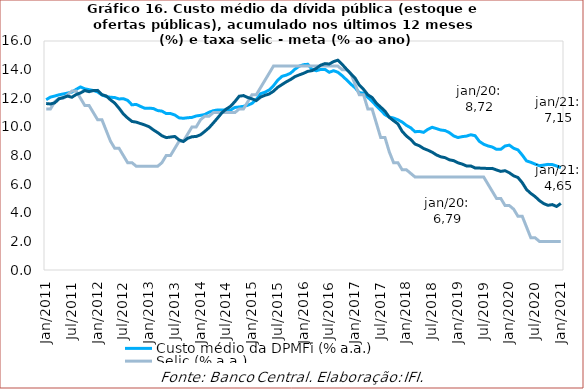
| Category | Custo médio da DPMFi (% a.a.) | Selic (% a.a.) | Custo médio oferta pública DPMFi (% a.a.) |
|---|---|---|---|
| 2011-01-31 | 11.9 | 11.25 | 11.63 |
| 2011-02-28 | 12.08 | 11.25 | 11.6 |
| 2011-03-31 | 12.155 | 11.75 | 11.68 |
| 2011-04-30 | 12.24 | 12 | 11.96 |
| 2011-05-31 | 12.3 | 12 | 12.05 |
| 2011-06-30 | 12.36 | 12.25 | 12.15 |
| 2011-07-31 | 12.43 | 12.5 | 12.07 |
| 2011-08-31 | 12.62 | 12.5 | 12.26 |
| 2011-09-30 | 12.79 | 12 | 12.37 |
| 2011-10-31 | 12.66 | 11.5 | 12.54 |
| 2011-11-30 | 12.6 | 11.5 | 12.46 |
| 2011-12-31 | 12.54 | 11 | 12.54 |
| 2012-01-31 | 12.44 | 10.5 | 12.55 |
| 2012-02-29 | 12.23 | 10.5 | 12.25 |
| 2012-03-31 | 12.12 | 9.75 | 12.16 |
| 2012-04-30 | 12.07 | 9 | 11.89 |
| 2012-05-31 | 12.05 | 8.5 | 11.66 |
| 2012-06-30 | 11.95 | 8.5 | 11.3 |
| 2012-07-31 | 11.97 | 8 | 10.9 |
| 2012-08-31 | 11.85 | 7.5 | 10.62 |
| 2012-09-30 | 11.54 | 7.5 | 10.38 |
| 2012-10-31 | 11.57 | 7.25 | 10.33 |
| 2012-11-30 | 11.43 | 7.25 | 10.23 |
| 2012-12-31 | 11.3 | 7.25 | 10.13 |
| 2013-01-31 | 11.31 | 7.25 | 10.01 |
| 2013-02-28 | 11.28 | 7.25 | 9.79 |
| 2013-03-31 | 11.14 | 7.25 | 9.6 |
| 2013-04-30 | 11.1 | 7.5 | 9.38 |
| 2013-05-31 | 10.93 | 8 | 9.25 |
| 2013-06-30 | 10.93 | 8 | 9.29 |
| 2013-07-31 | 10.83 | 8.5 | 9.33 |
| 2013-08-31 | 10.63 | 9 | 9.09 |
| 2013-09-30 | 10.6 | 9 | 8.98 |
| 2013-10-31 | 10.637 | 9.5 | 9.2 |
| 2013-11-30 | 10.663 | 10 | 9.31 |
| 2013-12-31 | 10.763 | 10 | 9.33 |
| 2014-01-31 | 10.805 | 10.5 | 9.449 |
| 2014-02-28 | 10.867 | 10.75 | 9.686 |
| 2014-03-31 | 11.027 | 10.75 | 9.946 |
| 2014-04-30 | 11.131 | 11 | 10.282 |
| 2014-05-31 | 11.182 | 11 | 10.629 |
| 2014-06-30 | 11.173 | 11 | 10.991 |
| 2014-07-31 | 11.197 | 11 | 11.246 |
| 2014-08-31 | 11.175 | 11 | 11.439 |
| 2014-09-30 | 11.356 | 11 | 11.764 |
| 2014-10-31 | 11.391 | 11.25 | 12.14 |
| 2014-11-30 | 11.435 | 11.25 | 12.187 |
| 2014-12-31 | 11.512 | 11.75 | 12.053 |
| 2015-01-31 | 11.643 | 12.25 | 11.956 |
| 2015-02-27 | 11.909 | 12.25 | 11.84 |
| 2015-03-31 | 12.323 | 12.75 | 12.08 |
| 2015-04-30 | 12.419 | 13.25 | 12.204 |
| 2015-05-31 | 12.579 | 13.75 | 12.297 |
| 2015-06-30 | 12.877 | 14.25 | 12.491 |
| 2015-07-31 | 13.263 | 14.25 | 12.765 |
| 2015-08-31 | 13.532 | 14.25 | 12.96 |
| 2015-09-30 | 13.618 | 14.25 | 13.15 |
| 2015-10-31 | 13.754 | 14.25 | 13.31 |
| 2015-11-30 | 14.029 | 14.25 | 13.51 |
| 2015-12-31 | 14.241 | 14.25 | 13.63 |
| 2016-01-31 | 14.346 | 14.25 | 13.74 |
| 2016-02-29 | 14.372 | 14.25 | 13.88 |
| 2016-03-31 | 14.015 | 14.25 | 13.93 |
| 2016-04-30 | 13.92 | 14.25 | 14.09 |
| 2016-05-31 | 14.016 | 14.25 | 14.31 |
| 2016-06-30 | 14.017 | 14.25 | 14.42 |
| 2016-07-31 | 13.814 | 14.25 | 14.39 |
| 2016-08-31 | 13.924 | 14.25 | 14.56 |
| 2016-09-30 | 13.82 | 14.25 | 14.66 |
| 2016-10-31 | 13.578 | 14 | 14.37 |
| 2016-11-30 | 13.296 | 14 | 14.04 |
| 2016-12-31 | 12.996 | 13.75 | 13.72 |
| 2017-01-31 | 12.739 | 13 | 13.42 |
| 2017-02-28 | 12.394 | 12.25 | 12.92 |
| 2017-03-31 | 12.351 | 12.25 | 12.62 |
| 2017-04-30 | 12.068 | 11.25 | 12.24 |
| 2017-05-31 | 11.784 | 11.25 | 12.05 |
| 2017-06-30 | 11.466 | 10.25 | 11.65 |
| 2017-07-31 | 11.168 | 9.25 | 11.38 |
| 2017-08-31 | 10.85 | 9.25 | 11.1 |
| 2017-09-30 | 10.68 | 8.25 | 10.67 |
| 2017-10-31 | 10.617 | 7.5 | 10.43 |
| 2017-11-30 | 10.498 | 7.5 | 10.21 |
| 2017-12-31 | 10.339 | 7 | 9.69 |
| 2018-01-31 | 10.104 | 7 | 9.36 |
| 2018-02-28 | 9.934 | 6.75 | 9.12 |
| 2018-03-31 | 9.659 | 6.5 | 8.8 |
| 2018-04-30 | 9.686 | 6.5 | 8.68 |
| 2018-05-31 | 9.617 | 6.5 | 8.49 |
| 2018-06-30 | 9.83 | 6.5 | 8.37 |
| 2018-07-31 | 9.971 | 6.5 | 8.23 |
| 2018-08-31 | 9.878 | 6.5 | 8.04 |
| 2018-09-30 | 9.78 | 6.5 | 7.91 |
| 2018-10-31 | 9.743 | 6.5 | 7.85 |
| 2018-11-30 | 9.6 | 6.5 | 7.7 |
| 2018-12-31 | 9.371 | 6.5 | 7.64 |
| 2019-01-31 | 9.254 | 6.5 | 7.49 |
| 2019-02-28 | 9.318 | 6.5 | 7.4 |
| 2019-03-31 | 9.355 | 6.5 | 7.27 |
| 2019-04-30 | 9.449 | 6.5 | 7.27 |
| 2019-05-31 | 9.385 | 6.5 | 7.13 |
| 2019-06-30 | 8.987 | 6.5 | 7.12 |
| 2019-07-31 | 8.788 | 6.5 | 7.11 |
| 2019-08-31 | 8.669 | 6 | 7.09 |
| 2019-09-30 | 8.594 | 5.5 | 7.1 |
| 2019-10-31 | 8.431 | 5 | 6.99 |
| 2019-11-30 | 8.435 | 5 | 6.89 |
| 2019-12-31 | 8.665 | 4.5 | 6.94 |
| 2020-01-31 | 8.723 | 4.5 | 6.79 |
| 2020-02-29 | 8.505 | 4.25 | 6.58 |
| 2020-03-31 | 8.392 | 3.75 | 6.46 |
| 2020-04-30 | 8.031 | 3.75 | 6.1 |
| 2020-05-31 | 7.621 | 3 | 5.62 |
| 2020-06-30 | 7.524 | 2.25 | 5.35 |
| 2020-07-31 | 7.398 | 2.25 | 5.13 |
| 2020-08-31 | 7.286 | 2 | 4.85 |
| 2020-09-30 | 7.331 | 2 | 4.64 |
| 2020-10-31 | 7.381 | 2 | 4.52 |
| 2020-11-30 | 7.365 | 2 | 4.57 |
| 2020-12-31 | 7.269 | 2 | 4.44 |
| 2021-01-31 | 7.146 | 2 | 4.649 |